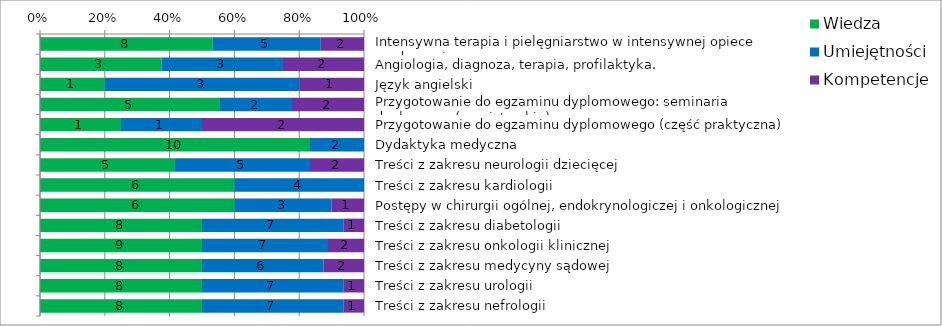
| Category | Wiedza | Umiejętności | Kompetencje |
|---|---|---|---|
| Intensywna terapia i pielęgniarstwo w intensywnej opiece medycznej | 8 | 5 | 2 |
| Angiologia, diagnoza, terapia, profilaktyka. | 3 | 3 | 2 |
| Język angielski | 1 | 3 | 1 |
| Przygotowanie do egzaminu dyplomowego: seminaria dyplomowe (magisterskie) | 5 | 2 | 2 |
| Przygotowanie do egzaminu dyplomowego (część praktyczna) | 1 | 1 | 2 |
| Dydaktyka medyczna | 10 | 2 | 0 |
| Treści z zakresu neurologii dziecięcej | 5 | 5 | 2 |
| Treści z zakresu kardiologii  | 6 | 4 | 0 |
| Postępy w chirurgii ogólnej, endokrynologiczej i onkologicznej | 6 | 3 | 1 |
| Treści z zakresu diabetologii | 8 | 7 | 1 |
| Treści z zakresu onkologii klinicznej | 9 | 7 | 2 |
| Treści z zakresu medycyny sądowej | 8 | 6 | 2 |
| Treści z zakresu urologii | 8 | 7 | 1 |
| Treści z zakresu nefrologii | 8 | 7 | 1 |